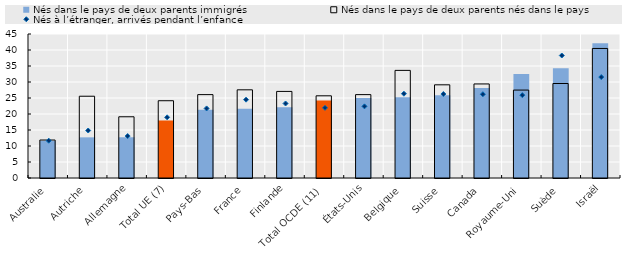
| Category | Nés dans le pays de deux parents immigrés | Nés dans le pays de deux parents nés dans le pays |
|---|---|---|
| Australie | 11.63 | 11.87 |
| Autriche | 12.704 | 25.555 |
| Allemagne | 12.732 | 19.134 |
| Total UE (7) | 17.935 | 24.146 |
| Pays-Bas | 21.32 | 26.056 |
| France | 21.628 | 27.555 |
| Finlande | 22.073 | 27.056 |
| Total OCDE (11) | 24.202 | 25.687 |
| États-Unis | 25.037 | 26.058 |
| Belgique | 25.203 | 33.629 |
| Suisse | 25.87 | 29.12 |
| Canada | 28.14 | 29.39 |
| Royaume-Uni | 32.51 | 27.48 |
| Suède | 34.259 | 29.527 |
| Israël | 42.11 | 40.48 |